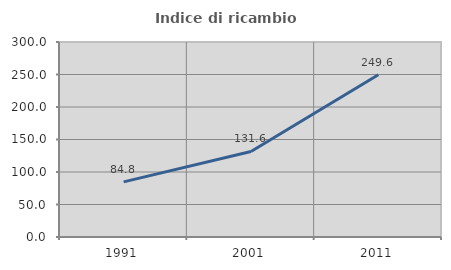
| Category | Indice di ricambio occupazionale  |
|---|---|
| 1991.0 | 84.794 |
| 2001.0 | 131.561 |
| 2011.0 | 249.573 |